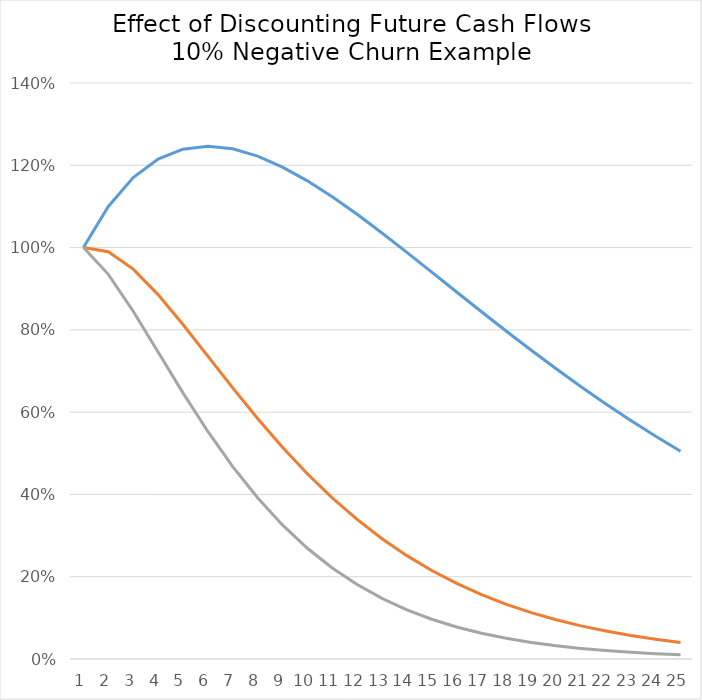
| Category | Series 0 | Series 1 | Series 2 |
|---|---|---|---|
| 0 | 1 | 1 | 1 |
| 1 | 1.1 | 0.99 | 0.935 |
| 2 | 1.17 | 0.948 | 0.845 |
| 3 | 1.215 | 0.886 | 0.746 |
| 4 | 1.239 | 0.813 | 0.647 |
| 5 | 1.247 | 0.736 | 0.553 |
| 6 | 1.24 | 0.659 | 0.468 |
| 7 | 1.222 | 0.585 | 0.392 |
| 8 | 1.196 | 0.515 | 0.326 |
| 9 | 1.162 | 0.45 | 0.269 |
| 10 | 1.123 | 0.392 | 0.221 |
| 11 | 1.081 | 0.339 | 0.181 |
| 12 | 1.035 | 0.292 | 0.147 |
| 13 | 0.988 | 0.251 | 0.12 |
| 14 | 0.94 | 0.215 | 0.097 |
| 15 | 0.892 | 0.184 | 0.078 |
| 16 | 0.844 | 0.156 | 0.063 |
| 17 | 0.797 | 0.133 | 0.05 |
| 18 | 0.75 | 0.113 | 0.04 |
| 19 | 0.705 | 0.095 | 0.032 |
| 20 | 0.662 | 0.08 | 0.026 |
| 21 | 0.62 | 0.068 | 0.02 |
| 22 | 0.58 | 0.057 | 0.016 |
| 23 | 0.542 | 0.048 | 0.013 |
| 24 | 0.505 | 0.04 | 0.01 |